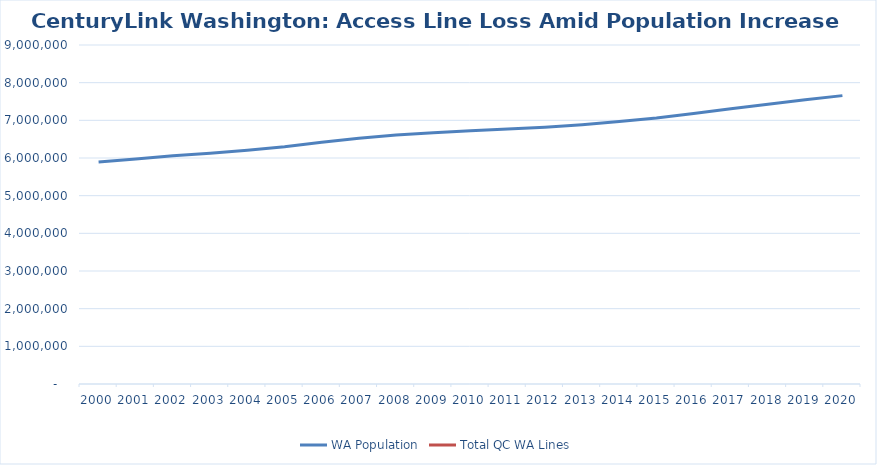
| Category | WA Population | Total QC WA Lines |
|---|---|---|
| 2000.0 | 5894143 |  |
| 2001.0 | 5970330 |  |
| 2002.0 | 6059316 |  |
| 2003.0 | 6126885 |  |
| 2004.0 | 6208515 |  |
| 2005.0 | 6298816 |  |
| 2006.0 | 6420258 |  |
| 2007.0 | 6525086 |  |
| 2008.0 | 6608245 |  |
| 2009.0 | 6672159 |  |
| 2010.0 | 6724540 |  |
| 2011.0 | 6767900 |  |
| 2012.0 | 6817770 |  |
| 2013.0 | 6882400 |  |
| 2014.0 | 6968170 |  |
| 2015.0 | 7061410 |  |
| 2016.0 | 7183700 |  |
| 2017.0 | 7310300 |  |
| 2018.0 | 7427570 |  |
| 2019.0 | 7546400 |  |
| 2020.0 | 7656200 |  |